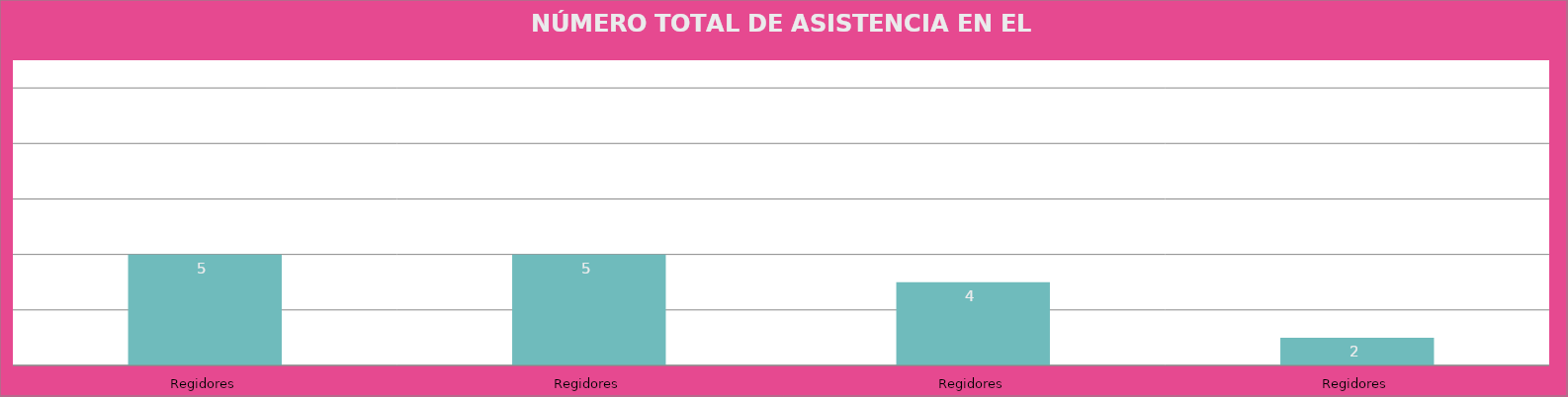
| Category | Regidores |
|---|---|
| Regidores | 5 |
| Regidores | 5 |
| Regidores | 4 |
| Regidores | 2 |